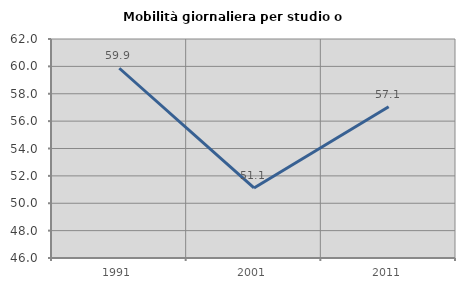
| Category | Mobilità giornaliera per studio o lavoro |
|---|---|
| 1991.0 | 59.863 |
| 2001.0 | 51.117 |
| 2011.0 | 57.053 |